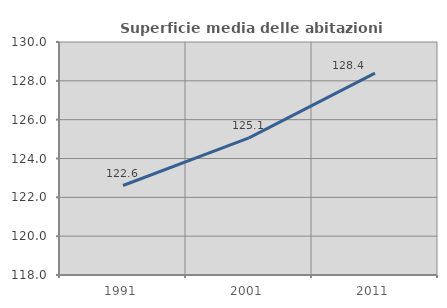
| Category | Superficie media delle abitazioni occupate |
|---|---|
| 1991.0 | 122.609 |
| 2001.0 | 125.061 |
| 2011.0 | 128.399 |